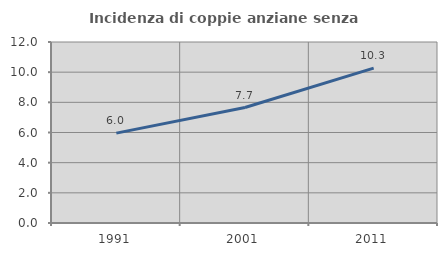
| Category | Incidenza di coppie anziane senza figli  |
|---|---|
| 1991.0 | 5.957 |
| 2001.0 | 7.654 |
| 2011.0 | 10.268 |